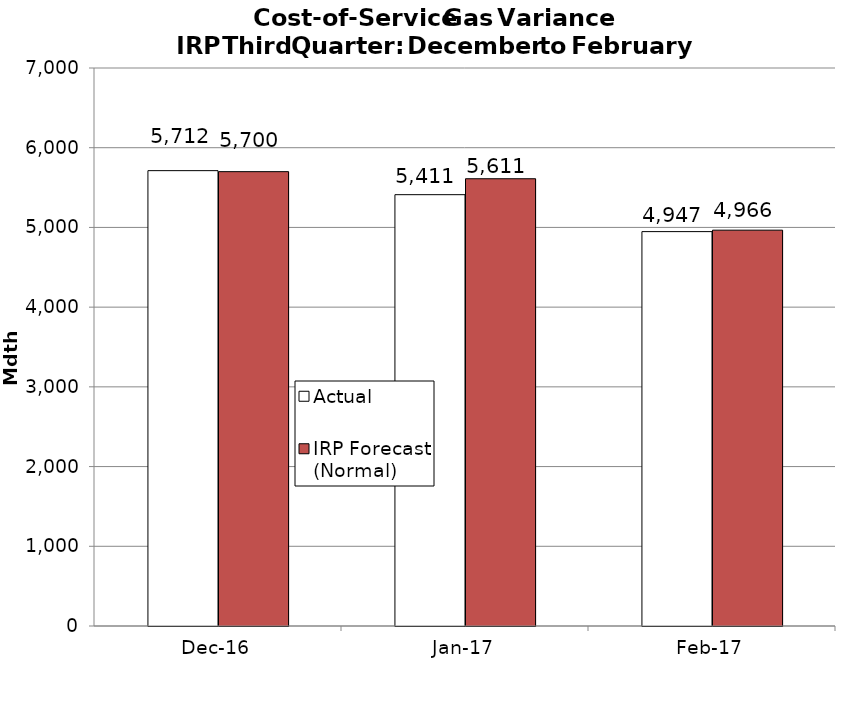
| Category | Actual | IRP Forecast (Normal) |
|---|---|---|
| 2016-12-01 | 5712.37 | 5699.654 |
| 2017-01-01 | 5410.81 | 5610.842 |
| 2017-02-01 | 4947.47 | 4965.635 |